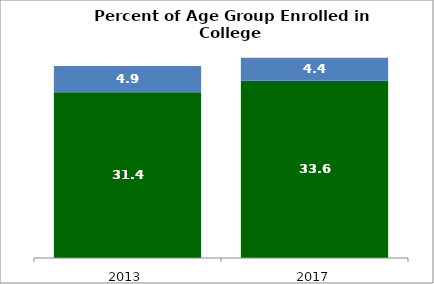
| Category | 18 to 24 | 25 to 49 |
|---|---|---|
| 2013.0 | 31.438 | 4.945 |
| 2017.0 | 33.593 | 4.376 |